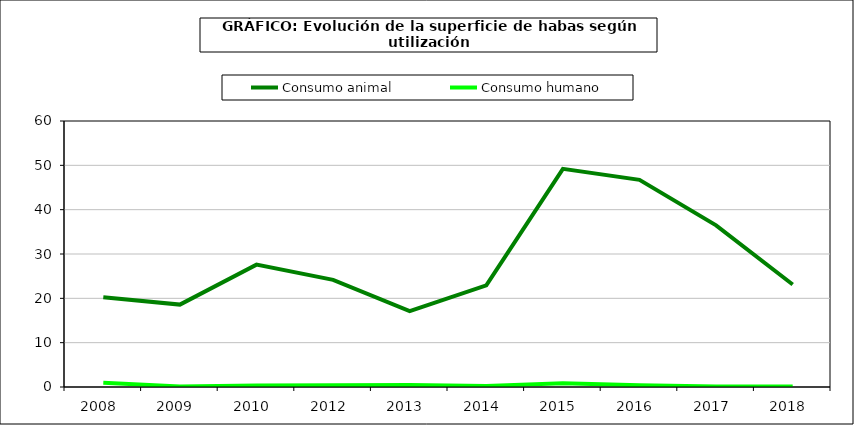
| Category | Consumo animal | Consumo humano |
|---|---|---|
| 2008  | 20.238 | 0.969 |
| 2009  | 18.586 | 0.118 |
| 2010  | 27.596 | 0.361 |
| 2012  | 24.156 | 0.408 |
| 2013  | 17.1 | 0.442 |
| 2014  | 22.918 | 0.247 |
| 2015  | 49.204 | 0.868 |
| 2016  | 46.723 | 0.386 |
| 2017  | 36.47 | 0.104 |
| 2018  | 23.126 | 0.108 |